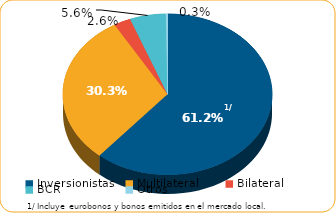
| Category | Series 0 |
|---|---|
| Inversionistas | 7761.8 |
| Multilateral | 3847.2 |
| Bilateral | 330.7 |
| BCR | 704.3 |
| Otros | 33.7 |